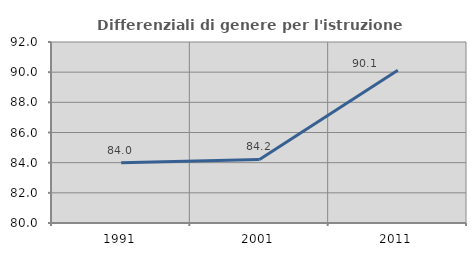
| Category | Differenziali di genere per l'istruzione superiore |
|---|---|
| 1991.0 | 83.992 |
| 2001.0 | 84.211 |
| 2011.0 | 90.123 |